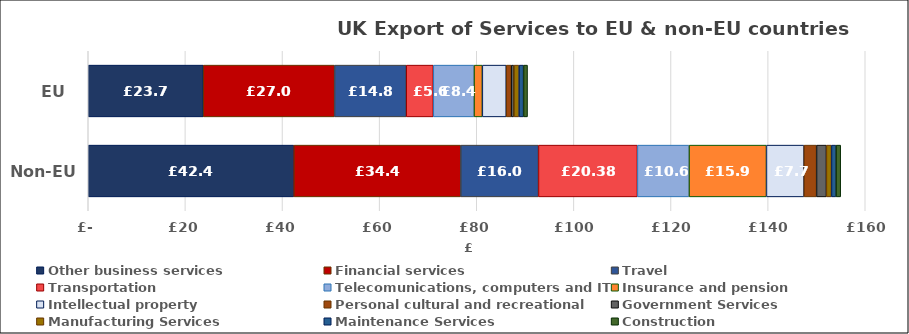
| Category | Other business services | Financial services | Travel | Transportation | Telecomunications, computers and IT | Insurance and pension | Intellectual property | Personal cultural and recreational | Government Services | Manufacturing Services | Maintenance Services | Construction |
|---|---|---|---|---|---|---|---|---|---|---|---|---|
|  EU  | 23.7 | 27.021 | 14.762 | 5.572 | 8.395 | 1.701 | 4.915 | 1.048 | 0.54 | 1.047 | 0.936 | 0.822 |
|  Non-EU  | 42.35 | 34.362 | 15.994 | 20.378 | 10.641 | 15.929 | 7.734 | 2.583 | 2.028 | 1.047 | 0.936 | 0.965 |